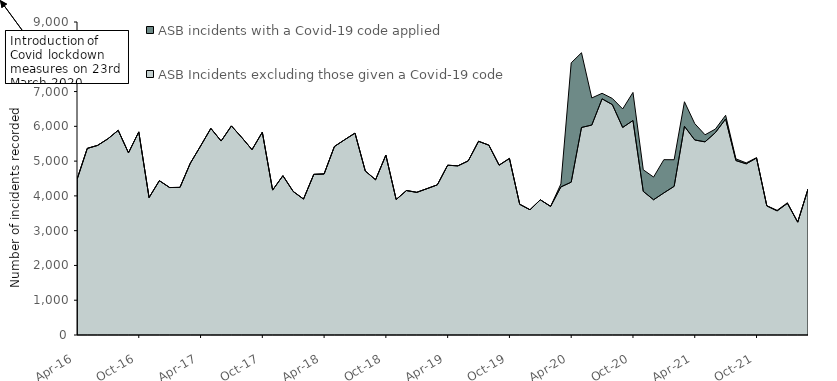
| Category | ASB Incidents excluding those given a Covid-19 code | ASB incidents with a Covid-19 code applied |
|---|---|---|
| 2016-04-01 | 4472 | 0 |
| 2016-05-01 | 5366 | 0 |
| 2016-06-01 | 5452 | 0 |
| 2016-07-01 | 5641 | 0 |
| 2016-08-01 | 5885 | 0 |
| 2016-09-01 | 5238 | 0 |
| 2016-10-01 | 5840 | 0 |
| 2016-11-01 | 3952 | 0 |
| 2016-12-01 | 4437 | 0 |
| 2017-01-01 | 4240 | 0 |
| 2017-02-01 | 4244 | 0 |
| 2017-03-01 | 4936 | 0 |
| 2017-04-01 | 5433 | 0 |
| 2017-05-01 | 5941 | 0 |
| 2017-06-01 | 5577 | 0 |
| 2017-07-01 | 6012 | 0 |
| 2017-08-01 | 5681 | 0 |
| 2017-09-01 | 5329 | 0 |
| 2017-10-01 | 5832 | 0 |
| 2017-11-01 | 4167 | 0 |
| 2017-12-01 | 4580 | 0 |
| 2018-01-01 | 4127 | 0 |
| 2018-02-01 | 3909 | 0 |
| 2018-03-01 | 4619 | 0 |
| 2018-04-01 | 4631 | 0 |
| 2018-05-01 | 5420 | 0 |
| 2018-06-01 | 5616 | 0 |
| 2018-07-01 | 5805 | 0 |
| 2018-08-01 | 4716 | 0 |
| 2018-09-01 | 4464 | 0 |
| 2018-10-01 | 5172 | 0 |
| 2018-11-01 | 3896 | 0 |
| 2018-12-01 | 4154 | 0 |
| 2019-01-01 | 4102 | 0 |
| 2019-02-01 | 4209 | 0 |
| 2019-03-01 | 4318 | 0 |
| 2019-04-01 | 4881 | 0 |
| 2019-05-01 | 4864 | 0 |
| 2019-06-01 | 5007 | 0 |
| 2019-07-01 | 5570 | 0 |
| 2019-08-01 | 5459 | 0 |
| 2019-09-01 | 4884 | 0 |
| 2019-10-01 | 5076 | 0 |
| 2019-11-01 | 3759 | 0 |
| 2019-12-01 | 3601 | 0 |
| 2020-01-01 | 3888 | 0 |
| 2020-02-01 | 3698 | 0 |
| 2020-03-01 | 4258 | 86 |
| 2020-04-01 | 4394 | 3431 |
| 2020-05-01 | 5967 | 2149 |
| 2020-06-01 | 6037 | 779 |
| 2020-07-01 | 6791 | 159 |
| 2020-08-01 | 6624 | 177 |
| 2020-09-01 | 5968 | 532 |
| 2020-10-01 | 6167 | 808 |
| 2020-11-01 | 4130 | 621 |
| 2020-12-01 | 3889 | 652 |
| 2021-01-01 | 4086 | 955 |
| 2021-02-01 | 4275 | 765 |
| 2021-03-01 | 6001 | 706 |
| 2021-04-01 | 5608 | 471 |
| 2021-05-01 | 5554 | 203 |
| 2021-06-01 | 5818 | 102 |
| 2021-07-01 | 6211 | 107 |
| 2021-08-01 | 5016 | 49 |
| 2021-09-01 | 4922 | 27 |
| 2021-10-01 | 5090 | 9 |
| 2021-11-01 | 3712 | 5 |
| 2021-12-01 | 3569 | 16 |
| 2022-01-01 | 3786 | 16 |
| 2022-02-01 | 3245 | 1 |
| 2022-03-01 | 4194 | 1 |